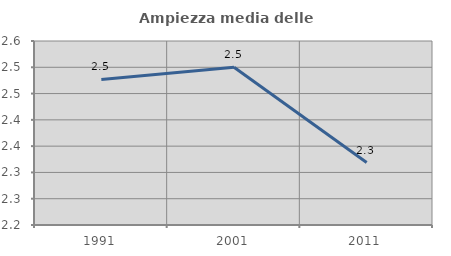
| Category | Ampiezza media delle famiglie |
|---|---|
| 1991.0 | 2.477 |
| 2001.0 | 2.5 |
| 2011.0 | 2.319 |